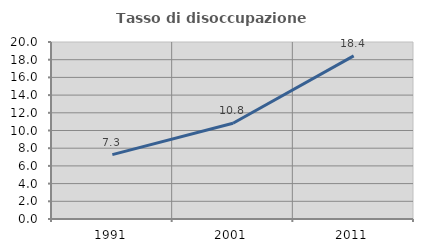
| Category | Tasso di disoccupazione giovanile  |
|---|---|
| 1991.0 | 7.269 |
| 2001.0 | 10.82 |
| 2011.0 | 18.431 |